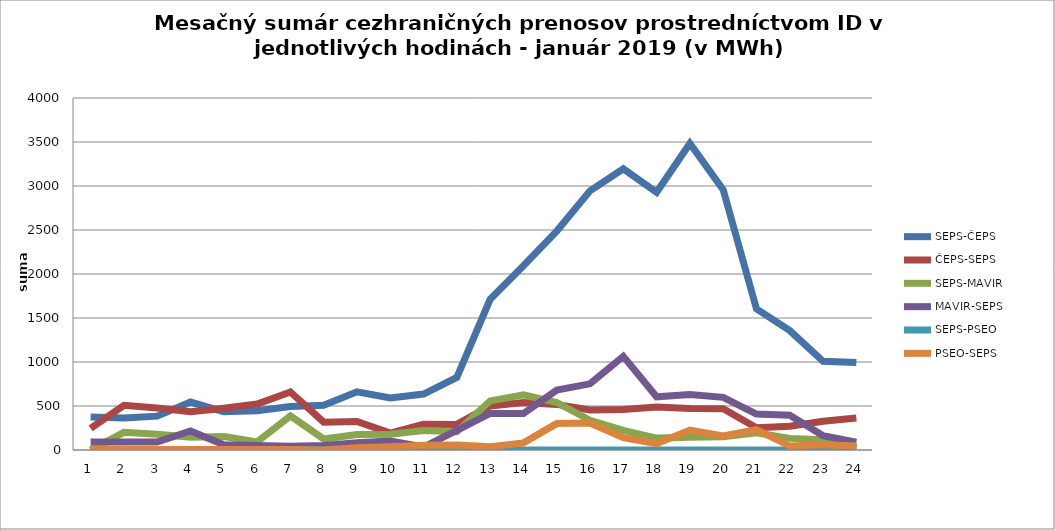
| Category | SEPS-ČEPS | ČEPS-SEPS | SEPS-MAVIR | MAVIR-SEPS | SEPS-PSEO | PSEO-SEPS |
|---|---|---|---|---|---|---|
| 1.0 | 376 | 245 | 1 | 90 | 0 | 10 |
| 2.0 | 364 | 508 | 201 | 91 | 0 | 8 |
| 3.0 | 385 | 478 | 180 | 90 | 0 | 7 |
| 4.0 | 545 | 434 | 145 | 217 | 0 | 6 |
| 5.0 | 434 | 474 | 154 | 59 | 0 | 5 |
| 6.0 | 447 | 522 | 92 | 52 | 0 | 5 |
| 7.0 | 493 | 660 | 387 | 43 | 0 | 5 |
| 8.0 | 509 | 316 | 125 | 51 | 0 | 0 |
| 9.0 | 661 | 325 | 176 | 82 | 0 | 25 |
| 10.0 | 591 | 193 | 180 | 102 | 0 | 38 |
| 11.0 | 636 | 292 | 222 | 34 | 0 | 54 |
| 12.0 | 824 | 291 | 209 | 224 | 0 | 58 |
| 13.0 | 1712 | 500 | 558 | 416 | 0 | 38 |
| 14.0 | 2094 | 540 | 627 | 414 | 0 | 81 |
| 15.0 | 2488 | 518 | 540 | 680 | 0 | 300 |
| 16.0 | 2945 | 455 | 338 | 752 | 0 | 307 |
| 17.0 | 3195 | 459 | 222 | 1064 | 0 | 140 |
| 18.0 | 2928 | 488 | 135 | 605 | 0 | 72 |
| 19.0 | 3484 | 471 | 146 | 631 | 0 | 227 |
| 20.0 | 2957 | 468 | 151 | 598 | 0 | 160 |
| 21.0 | 1604 | 252 | 195 | 408 | 0 | 232 |
| 22.0 | 1357 | 269 | 132 | 395 | 0 | 45 |
| 23.0 | 1009 | 326 | 118 | 162 | 0 | 61 |
| 24.0 | 995 | 363 | 32 | 90 | 50 | 45 |